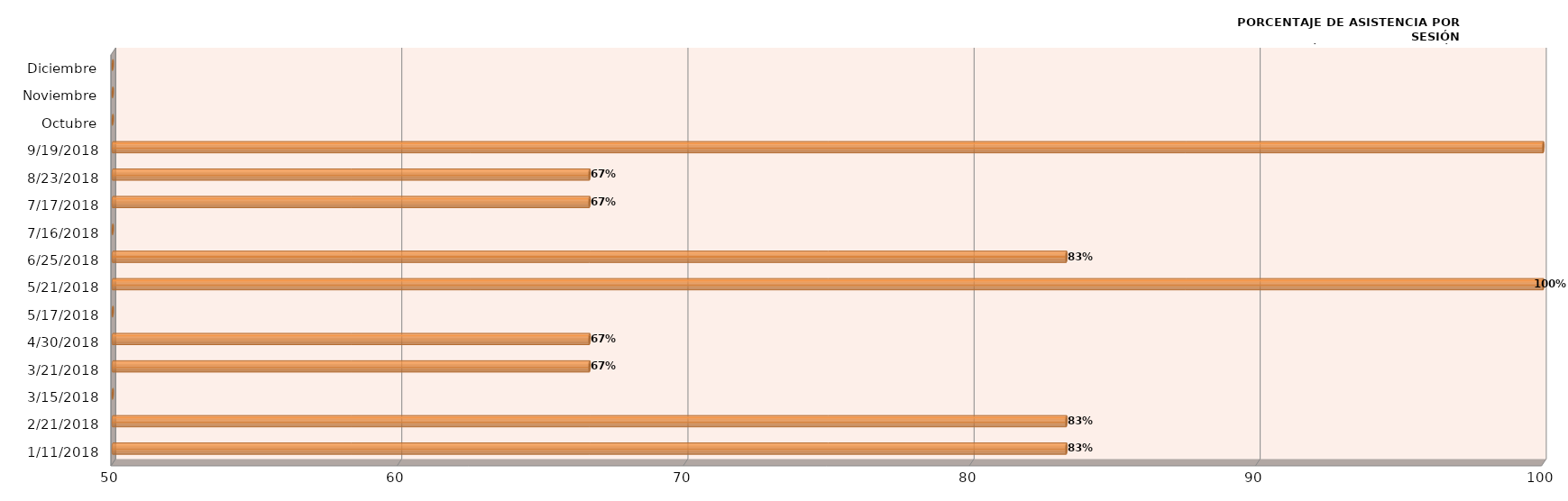
| Category | Series 0 |
|---|---|
| 11/01/2018 | 83.333 |
| 21/02/2018 | 83.333 |
| 15/03/2018 | 0 |
| 21/03/2018 | 66.667 |
| 30/04/2018 | 66.667 |
| 17/05/2018 | 0 |
| 21/05/2018 | 100 |
| 25/06/2018 | 83.333 |
| 16/07/2018 | 0 |
| 17/07/2018 | 66.667 |
| 23/08/2018 | 66.667 |
| 19/09/2018 | 100 |
| Octubre | 0 |
| Noviembre | 0 |
| Diciembre | 0 |